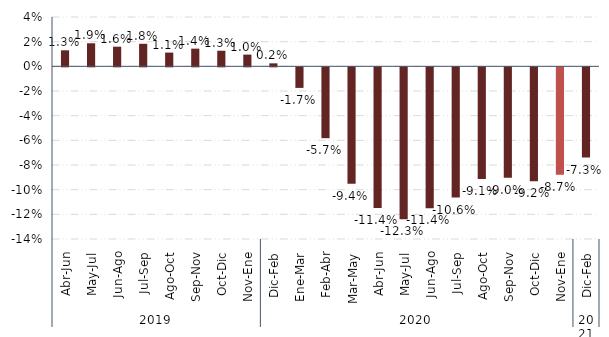
| Category | Total País |
|---|---|
| 0 | 0.013 |
| 1 | 0.019 |
| 2 | 0.016 |
| 3 | 0.018 |
| 4 | 0.011 |
| 5 | 0.014 |
| 6 | 0.013 |
| 7 | 0.01 |
| 8 | 0.002 |
| 9 | -0.017 |
| 10 | -0.057 |
| 11 | -0.094 |
| 12 | -0.114 |
| 13 | -0.123 |
| 14 | -0.114 |
| 15 | -0.106 |
| 16 | -0.091 |
| 17 | -0.09 |
| 18 | -0.092 |
| 19 | -0.087 |
| 20 | -0.073 |